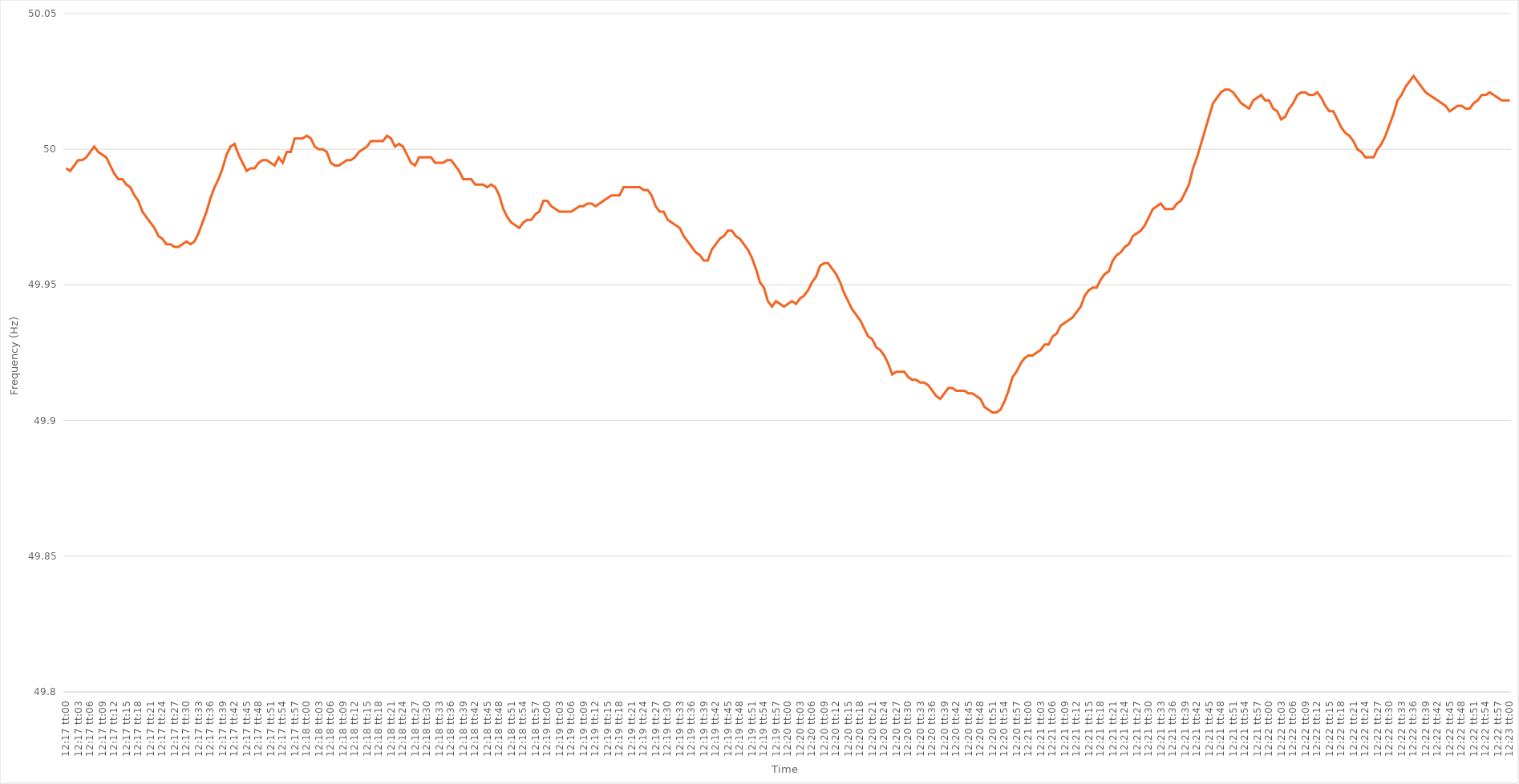
| Category | Series 0 |
|---|---|
| 0.5118055555555555 | 49.993 |
| 0.5118171296296297 | 49.992 |
| 0.5118287037037037 | 49.994 |
| 0.5118402777777779 | 49.996 |
| 0.5118518518518519 | 49.996 |
| 0.5118634259259259 | 49.997 |
| 0.511875 | 49.999 |
| 0.511886574074074 | 50.001 |
| 0.5118981481481482 | 49.999 |
| 0.5119097222222222 | 49.998 |
| 0.5119212962962963 | 49.997 |
| 0.5119328703703704 | 49.994 |
| 0.5119444444444444 | 49.991 |
| 0.5119560185185185 | 49.989 |
| 0.5119675925925926 | 49.989 |
| 0.5119791666666667 | 49.987 |
| 0.5119907407407408 | 49.986 |
| 0.5120023148148148 | 49.983 |
| 0.5120138888888889 | 49.981 |
| 0.5120254629629629 | 49.977 |
| 0.5120370370370371 | 49.975 |
| 0.5120486111111111 | 49.973 |
| 0.5120601851851853 | 49.971 |
| 0.5120717592592593 | 49.968 |
| 0.5120833333333333 | 49.967 |
| 0.5120949074074074 | 49.965 |
| 0.5121064814814814 | 49.965 |
| 0.5121180555555556 | 49.964 |
| 0.5121296296296296 | 49.964 |
| 0.5121412037037038 | 49.965 |
| 0.5121527777777778 | 49.966 |
| 0.5121643518518518 | 49.965 |
| 0.5121759259259259 | 49.966 |
| 0.5121875 | 49.969 |
| 0.5121990740740741 | 49.973 |
| 0.5122106481481482 | 49.977 |
| 0.5122222222222222 | 49.982 |
| 0.5122337962962963 | 49.986 |
| 0.5122453703703703 | 49.989 |
| 0.5122569444444445 | 49.993 |
| 0.5122685185185185 | 49.998 |
| 0.5122800925925927 | 50.001 |
| 0.5122916666666667 | 50.002 |
| 0.5123032407407407 | 49.998 |
| 0.5123148148148148 | 49.995 |
| 0.5123263888888888 | 49.992 |
| 0.512337962962963 | 49.993 |
| 0.512349537037037 | 49.993 |
| 0.5123611111111112 | 49.995 |
| 0.5123726851851852 | 49.996 |
| 0.5123842592592592 | 49.996 |
| 0.5123958333333333 | 49.995 |
| 0.5124074074074074 | 49.994 |
| 0.5124189814814815 | 49.997 |
| 0.5124305555555556 | 49.995 |
| 0.5124421296296297 | 49.999 |
| 0.5124537037037037 | 49.999 |
| 0.5124652777777777 | 50.004 |
| 0.5124768518518519 | 50.004 |
| 0.5124884259259259 | 50.004 |
| 0.5125000000000001 | 50.005 |
| 0.5125115740740741 | 50.004 |
| 0.5125231481481481 | 50.001 |
| 0.5125347222222222 | 50 |
| 0.5125462962962963 | 50 |
| 0.5125578703703704 | 49.999 |
| 0.5125694444444444 | 49.995 |
| 0.5125810185185186 | 49.994 |
| 0.5125925925925926 | 49.994 |
| 0.5126041666666666 | 49.995 |
| 0.5126157407407407 | 49.996 |
| 0.5126273148148148 | 49.996 |
| 0.5126388888888889 | 49.997 |
| 0.512650462962963 | 49.999 |
| 0.512662037037037 | 50 |
| 0.5126736111111111 | 50.001 |
| 0.5126851851851851 | 50.003 |
| 0.5126967592592593 | 50.003 |
| 0.5127083333333333 | 50.003 |
| 0.5127199074074075 | 50.003 |
| 0.5127314814814815 | 50.005 |
| 0.5127430555555555 | 50.004 |
| 0.5127546296296296 | 50.001 |
| 0.5127662037037037 | 50.002 |
| 0.5127777777777778 | 50.001 |
| 0.5127893518518518 | 49.998 |
| 0.512800925925926 | 49.995 |
| 0.5128125 | 49.994 |
| 0.512824074074074 | 49.997 |
| 0.5128356481481481 | 49.997 |
| 0.5128472222222222 | 49.997 |
| 0.5128587962962963 | 49.997 |
| 0.5128703703703704 | 49.995 |
| 0.5128819444444445 | 49.995 |
| 0.5128935185185185 | 49.995 |
| 0.5129050925925925 | 49.996 |
| 0.5129166666666667 | 49.996 |
| 0.5129282407407407 | 49.994 |
| 0.5129398148148149 | 49.992 |
| 0.5129513888888889 | 49.989 |
| 0.512962962962963 | 49.989 |
| 0.512974537037037 | 49.989 |
| 0.5129861111111111 | 49.987 |
| 0.5129976851851852 | 49.987 |
| 0.5130092592592593 | 49.987 |
| 0.5130208333333334 | 49.986 |
| 0.5130324074074074 | 49.987 |
| 0.5130439814814814 | 49.986 |
| 0.5130555555555555 | 49.983 |
| 0.5130671296296296 | 49.978 |
| 0.5130787037037037 | 49.975 |
| 0.5130902777777778 | 49.973 |
| 0.5131018518518519 | 49.972 |
| 0.5131134259259259 | 49.971 |
| 0.5131249999999999 | 49.973 |
| 0.5131365740740741 | 49.974 |
| 0.5131481481481481 | 49.974 |
| 0.5131597222222223 | 49.976 |
| 0.5131712962962963 | 49.977 |
| 0.5131828703703704 | 49.981 |
| 0.5131944444444444 | 49.981 |
| 0.5132060185185185 | 49.979 |
| 0.5132175925925926 | 49.978 |
| 0.5132291666666667 | 49.977 |
| 0.5132407407407408 | 49.977 |
| 0.5132523148148148 | 49.977 |
| 0.5132638888888889 | 49.977 |
| 0.5132754629629629 | 49.978 |
| 0.513287037037037 | 49.979 |
| 0.5132986111111111 | 49.979 |
| 0.5133101851851852 | 49.98 |
| 0.5133217592592593 | 49.98 |
| 0.5133333333333333 | 49.979 |
| 0.5133449074074073 | 49.98 |
| 0.5133564814814815 | 49.981 |
| 0.5133680555555555 | 49.982 |
| 0.5133796296296297 | 49.983 |
| 0.5133912037037037 | 49.983 |
| 0.5134027777777778 | 49.983 |
| 0.5134143518518518 | 49.986 |
| 0.513425925925926 | 49.986 |
| 0.5134375 | 49.986 |
| 0.5134490740740741 | 49.986 |
| 0.5134606481481482 | 49.986 |
| 0.5134722222222222 | 49.985 |
| 0.5134837962962963 | 49.985 |
| 0.5134953703703703 | 49.983 |
| 0.5135069444444444 | 49.979 |
| 0.5135185185185185 | 49.977 |
| 0.5135300925925926 | 49.977 |
| 0.5135416666666667 | 49.974 |
| 0.5135532407407407 | 49.973 |
| 0.5135648148148148 | 49.972 |
| 0.5135763888888889 | 49.971 |
| 0.5135879629629629 | 49.968 |
| 0.5135995370370371 | 49.966 |
| 0.5136111111111111 | 49.964 |
| 0.5136226851851852 | 49.962 |
| 0.5136342592592592 | 49.961 |
| 0.5136458333333334 | 49.959 |
| 0.5136574074074074 | 49.959 |
| 0.5136689814814815 | 49.963 |
| 0.5136805555555556 | 49.965 |
| 0.5136921296296296 | 49.967 |
| 0.5137037037037037 | 49.968 |
| 0.5137152777777778 | 49.97 |
| 0.5137268518518519 | 49.97 |
| 0.513738425925926 | 49.968 |
| 0.51375 | 49.967 |
| 0.5137615740740741 | 49.965 |
| 0.5137731481481481 | 49.963 |
| 0.5137847222222222 | 49.96 |
| 0.5137962962962963 | 49.956 |
| 0.5138078703703703 | 49.951 |
| 0.5138194444444445 | 49.949 |
| 0.5138310185185185 | 49.944 |
| 0.5138425925925926 | 49.942 |
| 0.5138541666666666 | 49.944 |
| 0.5138657407407408 | 49.943 |
| 0.5138773148148148 | 49.942 |
| 0.513888888888889 | 49.943 |
| 0.513900462962963 | 49.944 |
| 0.513912037037037 | 49.943 |
| 0.5139236111111111 | 49.945 |
| 0.5139351851851852 | 49.946 |
| 0.5139467592592593 | 49.948 |
| 0.5139583333333334 | 49.951 |
| 0.5139699074074074 | 49.953 |
| 0.5139814814814815 | 49.957 |
| 0.5139930555555555 | 49.958 |
| 0.5140046296296296 | 49.958 |
| 0.5140162037037037 | 49.956 |
| 0.5140277777777778 | 49.954 |
| 0.5140393518518519 | 49.951 |
| 0.5140509259259259 | 49.947 |
| 0.5140625 | 49.944 |
| 0.514074074074074 | 49.941 |
| 0.5140856481481482 | 49.939 |
| 0.5140972222222222 | 49.937 |
| 0.5141087962962964 | 49.934 |
| 0.5141203703703704 | 49.931 |
| 0.5141319444444444 | 49.93 |
| 0.5141435185185185 | 49.927 |
| 0.5141550925925926 | 49.926 |
| 0.5141666666666667 | 49.924 |
| 0.5141782407407408 | 49.921 |
| 0.5141898148148148 | 49.917 |
| 0.5142013888888889 | 49.918 |
| 0.5142129629629629 | 49.918 |
| 0.514224537037037 | 49.918 |
| 0.5142361111111111 | 49.916 |
| 0.5142476851851852 | 49.915 |
| 0.5142592592592593 | 49.915 |
| 0.5142708333333333 | 49.914 |
| 0.5142824074074074 | 49.914 |
| 0.5142939814814814 | 49.913 |
| 0.5143055555555556 | 49.911 |
| 0.5143171296296296 | 49.909 |
| 0.5143287037037038 | 49.908 |
| 0.5143402777777778 | 49.91 |
| 0.5143518518518518 | 49.912 |
| 0.5143634259259259 | 49.912 |
| 0.514375 | 49.911 |
| 0.5143865740740741 | 49.911 |
| 0.5143981481481482 | 49.911 |
| 0.5144097222222223 | 49.91 |
| 0.5144212962962963 | 49.91 |
| 0.5144328703703703 | 49.909 |
| 0.5144444444444445 | 49.908 |
| 0.5144560185185185 | 49.905 |
| 0.5144675925925926 | 49.904 |
| 0.5144791666666667 | 49.903 |
| 0.5144907407407407 | 49.903 |
| 0.5145023148148148 | 49.904 |
| 0.5145138888888888 | 49.907 |
| 0.514525462962963 | 49.911 |
| 0.514537037037037 | 49.916 |
| 0.5145486111111112 | 49.918 |
| 0.5145601851851852 | 49.921 |
| 0.5145717592592592 | 49.923 |
| 0.5145833333333333 | 49.924 |
| 0.5145949074074074 | 49.924 |
| 0.5146064814814815 | 49.925 |
| 0.5146180555555556 | 49.926 |
| 0.5146296296296297 | 49.928 |
| 0.5146412037037037 | 49.928 |
| 0.5146527777777777 | 49.931 |
| 0.5146643518518519 | 49.932 |
| 0.5146759259259259 | 49.935 |
| 0.5146875 | 49.936 |
| 0.5146990740740741 | 49.937 |
| 0.5147106481481482 | 49.938 |
| 0.5147222222222222 | 49.94 |
| 0.5147337962962962 | 49.942 |
| 0.5147453703703704 | 49.946 |
| 0.5147569444444444 | 49.948 |
| 0.5147685185185186 | 49.949 |
| 0.5147800925925926 | 49.949 |
| 0.5147916666666666 | 49.952 |
| 0.5148032407407407 | 49.954 |
| 0.5148148148148148 | 49.955 |
| 0.5148263888888889 | 49.959 |
| 0.514837962962963 | 49.961 |
| 0.5148495370370371 | 49.962 |
| 0.5148611111111111 | 49.964 |
| 0.5148726851851851 | 49.965 |
| 0.5148842592592593 | 49.968 |
| 0.5148958333333333 | 49.969 |
| 0.5149074074074074 | 49.97 |
| 0.5149189814814815 | 49.972 |
| 0.5149305555555556 | 49.975 |
| 0.5149421296296296 | 49.978 |
| 0.5149537037037036 | 49.979 |
| 0.5149652777777778 | 49.98 |
| 0.5149768518518518 | 49.978 |
| 0.514988425925926 | 49.978 |
| 0.515 | 49.978 |
| 0.515011574074074 | 49.98 |
| 0.5150231481481481 | 49.981 |
| 0.5150347222222222 | 49.984 |
| 0.5150462962962963 | 49.987 |
| 0.5150578703703704 | 49.993 |
| 0.5150694444444445 | 49.997 |
| 0.5150810185185185 | 50.002 |
| 0.5150925925925925 | 50.007 |
| 0.5151041666666667 | 50.012 |
| 0.5151157407407407 | 50.017 |
| 0.5151273148148149 | 50.019 |
| 0.5151388888888889 | 50.021 |
| 0.515150462962963 | 50.022 |
| 0.515162037037037 | 50.022 |
| 0.515173611111111 | 50.021 |
| 0.5151851851851852 | 50.019 |
| 0.5151967592592592 | 50.017 |
| 0.5152083333333334 | 50.016 |
| 0.5152199074074074 | 50.015 |
| 0.5152314814814815 | 50.018 |
| 0.5152430555555555 | 50.019 |
| 0.5152546296296296 | 50.02 |
| 0.5152662037037037 | 50.018 |
| 0.5152777777777778 | 50.018 |
| 0.5152893518518519 | 50.015 |
| 0.5153009259259259 | 50.014 |
| 0.5153125 | 50.011 |
| 0.5153240740740741 | 50.012 |
| 0.5153356481481481 | 50.015 |
| 0.5153472222222223 | 50.017 |
| 0.5153587962962963 | 50.02 |
| 0.5153703703703704 | 50.021 |
| 0.5153819444444444 | 50.021 |
| 0.5153935185185184 | 50.02 |
| 0.5154050925925926 | 50.02 |
| 0.5154166666666666 | 50.021 |
| 0.5154282407407408 | 50.019 |
| 0.5154398148148148 | 50.016 |
| 0.5154513888888889 | 50.014 |
| 0.5154629629629629 | 50.014 |
| 0.515474537037037 | 50.011 |
| 0.5154861111111111 | 50.008 |
| 0.5154976851851852 | 50.006 |
| 0.5155092592592593 | 50.005 |
| 0.5155208333333333 | 50.003 |
| 0.5155324074074074 | 50 |
| 0.5155439814814815 | 49.999 |
| 0.5155555555555555 | 49.997 |
| 0.5155671296296297 | 49.997 |
| 0.5155787037037037 | 49.997 |
| 0.5155902777777778 | 50 |
| 0.5156018518518518 | 50.002 |
| 0.515613425925926 | 50.005 |
| 0.515625 | 50.009 |
| 0.515636574074074 | 50.013 |
| 0.5156481481481482 | 50.018 |
| 0.5156597222222222 | 50.02 |
| 0.5156712962962963 | 50.023 |
| 0.5156828703703703 | 50.025 |
| 0.5156944444444445 | 50.027 |
| 0.5157060185185185 | 50.025 |
| 0.5157175925925926 | 50.023 |
| 0.5157291666666667 | 50.021 |
| 0.5157407407407407 | 50.02 |
| 0.5157523148148148 | 50.019 |
| 0.5157638888888889 | 50.018 |
| 0.515775462962963 | 50.017 |
| 0.5157870370370371 | 50.016 |
| 0.5157986111111111 | 50.014 |
| 0.5158101851851852 | 50.015 |
| 0.5158217592592592 | 50.016 |
| 0.5158333333333334 | 50.016 |
| 0.5158449074074074 | 50.015 |
| 0.5158564814814816 | 50.015 |
| 0.5158680555555556 | 50.017 |
| 0.5158796296296296 | 50.018 |
| 0.5158912037037037 | 50.02 |
| 0.5159027777777777 | 50.02 |
| 0.5159143518518519 | 50.021 |
| 0.5159259259259259 | 50.02 |
| 0.5159375 | 50.019 |
| 0.5159490740740741 | 50.018 |
| 0.5159606481481481 | 50.018 |
| 0.5159722222222222 | 50.018 |